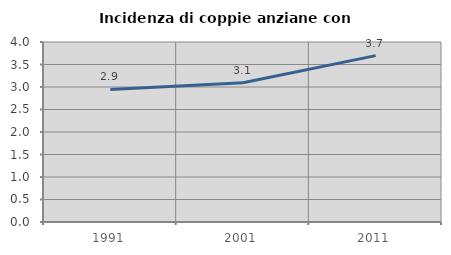
| Category | Incidenza di coppie anziane con figli |
|---|---|
| 1991.0 | 2.947 |
| 2001.0 | 3.092 |
| 2011.0 | 3.697 |